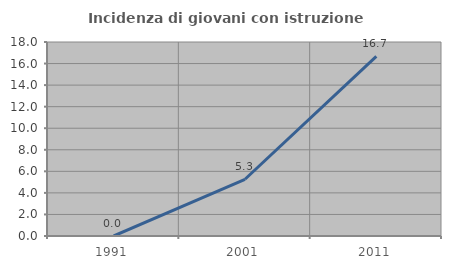
| Category | Incidenza di giovani con istruzione universitaria |
|---|---|
| 1991.0 | 0 |
| 2001.0 | 5.263 |
| 2011.0 | 16.667 |